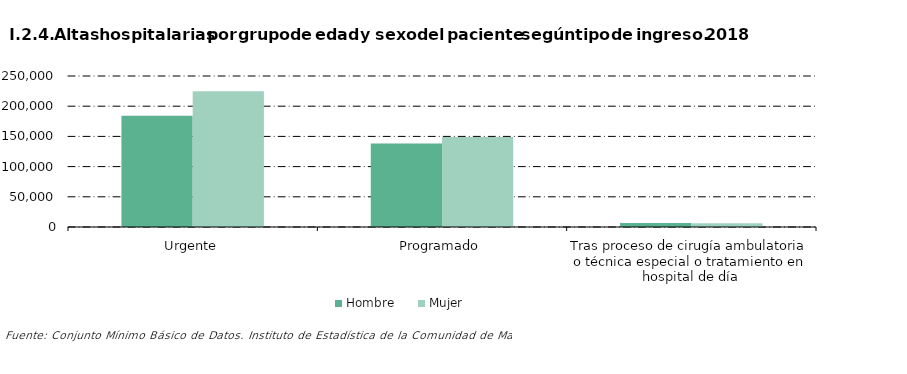
| Category |     Hombre |     Mujer |
|---|---|---|
| 0 | 184061 | 224567 |
| 1 | 138203 | 148850 |
| 2 | 6552 | 6151 |